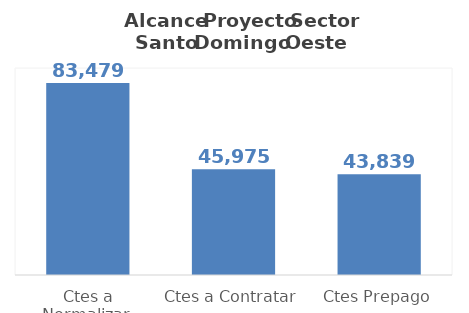
| Category | Series 0 |
|---|---|
| Ctes a Normalizar  | 83479.4 |
| Ctes a Contratar | 45975.119 |
| Ctes Prepago | 43839.2 |